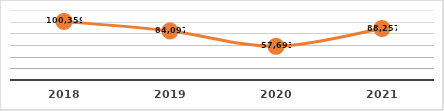
| Category | PERSONAS CAPACITADAS
TERCER TRIMESTRE, EJERCICIO 2021 |
|---|---|
| 2018.0 | 100359 |
| 2019.0 | 84097 |
| 2020.0 | 57693 |
| 2021.0 | 88257 |